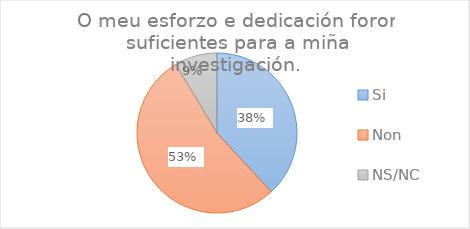
| Category | Series 25 | Series 0 | Series 1 |
|---|---|---|---|
| Si | 0.381 | 0 | 71 |
| Non | 0.532 | 0 | 29 |
| NS/NC | 0.086 | 0 | 39 |